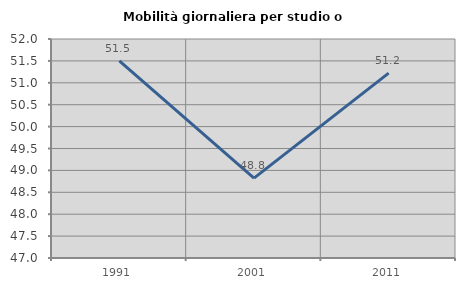
| Category | Mobilità giornaliera per studio o lavoro |
|---|---|
| 1991.0 | 51.5 |
| 2001.0 | 48.824 |
| 2011.0 | 51.22 |